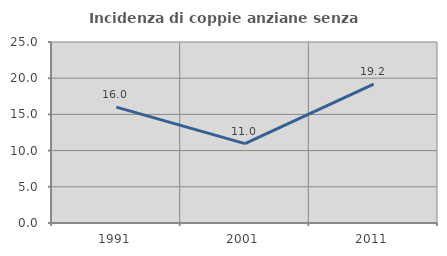
| Category | Incidenza di coppie anziane senza figli  |
|---|---|
| 1991.0 | 16 |
| 2001.0 | 10.959 |
| 2011.0 | 19.178 |